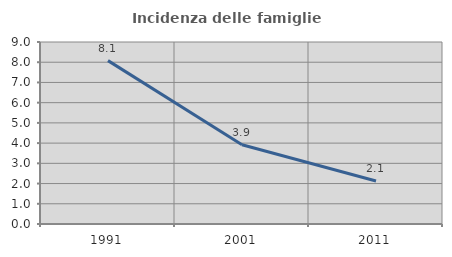
| Category | Incidenza delle famiglie numerose |
|---|---|
| 1991.0 | 8.08 |
| 2001.0 | 3.922 |
| 2011.0 | 2.125 |